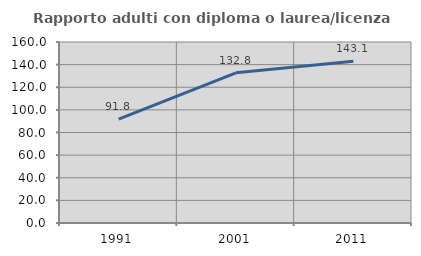
| Category | Rapporto adulti con diploma o laurea/licenza media  |
|---|---|
| 1991.0 | 91.786 |
| 2001.0 | 132.767 |
| 2011.0 | 143.082 |